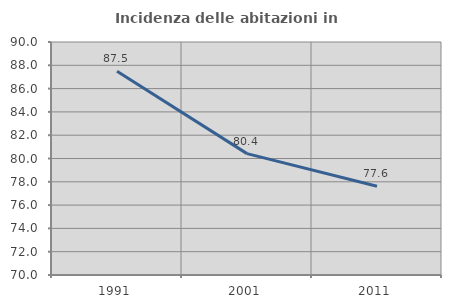
| Category | Incidenza delle abitazioni in proprietà  |
|---|---|
| 1991.0 | 87.481 |
| 2001.0 | 80.418 |
| 2011.0 | 77.621 |